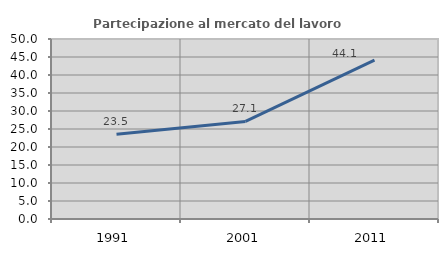
| Category | Partecipazione al mercato del lavoro  femminile |
|---|---|
| 1991.0 | 23.529 |
| 2001.0 | 27.097 |
| 2011.0 | 44.138 |